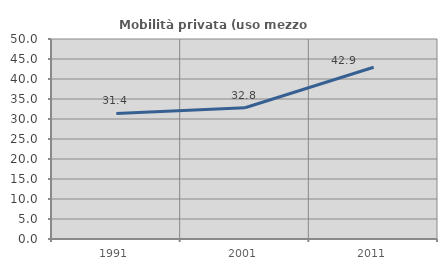
| Category | Mobilità privata (uso mezzo privato) |
|---|---|
| 1991.0 | 31.399 |
| 2001.0 | 32.812 |
| 2011.0 | 42.949 |